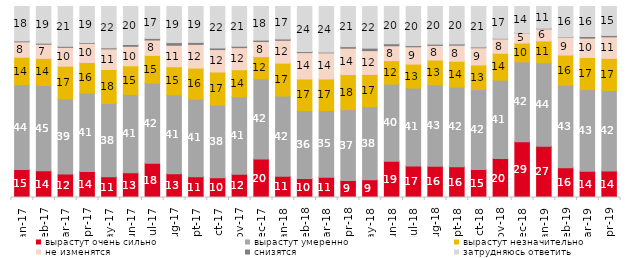
| Category | вырастут очень сильно | вырастут умеренно | вырастут незначительно | не изменятся | снизятся | затрудняюсь ответить |
|---|---|---|---|---|---|---|
| 2017-01-01 | 14.65 | 44.35 | 14.45 | 8.05 | 0.5 | 18 |
| 2017-02-01 | 13.95 | 44.7 | 14.2 | 7.4 | 0.55 | 19.2 |
| 2017-03-01 | 12.25 | 39.35 | 17.15 | 9.85 | 0.55 | 20.85 |
| 2017-04-01 | 13.55 | 41.15 | 16 | 9.95 | 0.4 | 18.95 |
| 2017-05-01 | 10.9 | 38.3 | 17.8 | 10.8 | 0.55 | 21.65 |
| 2017-06-01 | 13 | 40.95 | 15 | 10.2 | 0.95 | 19.9 |
| 2017-07-01 | 17.95 | 41.95 | 14.5 | 8.05 | 0.85 | 16.7 |
| 2017-08-01 | 12.5 | 41.25 | 14.7 | 11.25 | 1.4 | 18.9 |
| 2017-09-01 | 10.9 | 40.55 | 16.3 | 12.4 | 1.05 | 18.8 |
| 2017-10-01 | 10.4 | 37.95 | 17.35 | 11.75 | 0.85 | 21.7 |
| 2017-11-01 | 12.2 | 40.5 | 14.2 | 11.55 | 0.75 | 20.8 |
| 2017-12-01 | 20.1 | 42.05 | 11.6 | 7.9 | 0.75 | 17.6 |
| 2018-01-01 | 11.1 | 42 | 17.25 | 11.95 | 0.7 | 17 |
| 2018-02-01 | 10 | 35.5 | 16.55 | 13.8 | 0.55 | 23.6 |
| 2018-03-01 | 10.65 | 34.9 | 16.5 | 13.7 | 0.35 | 23.9 |
| 2018-04-01 | 8.95 | 37.05 | 18.4 | 13.75 | 0.85 | 21 |
| 2018-05-01 | 9.3 | 38.2 | 16.95 | 12.45 | 1.3 | 21.8 |
| 2018-06-01 | 18.95 | 40.4 | 12.3 | 7.8 | 1.05 | 19.5 |
| 2018-07-01 | 16.55 | 40.75 | 12.55 | 9.05 | 0.65 | 20.45 |
| 2018-08-01 | 16.35 | 42.7 | 12.9 | 7.7 | 0.65 | 19.7 |
| 2018-09-01 | 16.05 | 41.75 | 13.55 | 8.4 | 0.65 | 19.6 |
| 2018-10-01 | 14.6 | 42 | 12.8 | 9 | 0.4 | 21.2 |
| 2018-11-01 | 20.359 | 41.068 | 14.072 | 7.585 | 0.25 | 16.667 |
| 2018-12-01 | 29.25 | 41.8 | 9.8 | 5.4 | 0.1 | 13.65 |
| 2019-01-01 | 26.85 | 43.65 | 11.45 | 6.35 | 0.3 | 11.4 |
| 2019-02-01 | 15.6 | 43.2 | 15.8 | 9.35 | 0.15 | 15.9 |
| 2019-03-01 | 13.774 | 42.715 | 16.808 | 10.144 | 0.845 | 15.714 |
| 2019-04-01 | 13.911 | 42.129 | 16.832 | 11.238 | 0.743 | 15.149 |